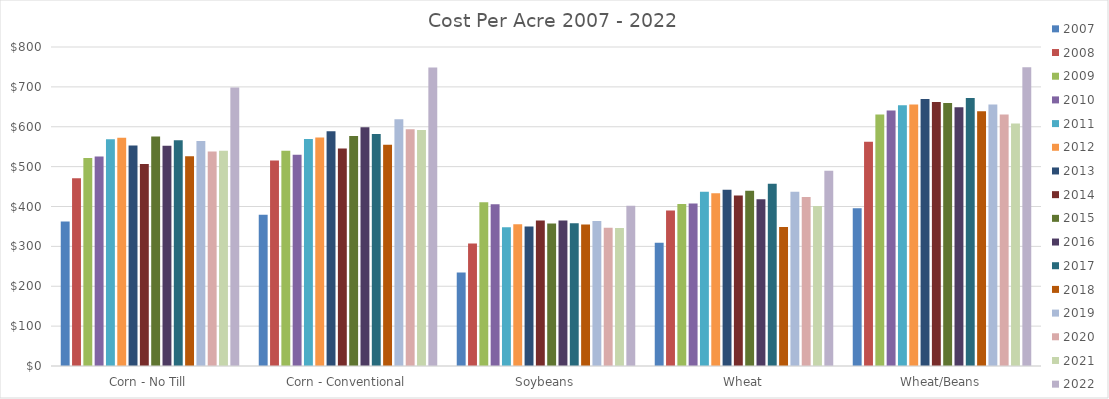
| Category | 2007 | 2008 | 2009 | 2010 | 2011 | 2012 | 2013 | 2014 | 2015 | 2016 | 2017 | 2018 | 2019 | 2020 | 2021 | 2022 |
|---|---|---|---|---|---|---|---|---|---|---|---|---|---|---|---|---|
| Corn - No Till | 362.4 | 470.72 | 521.49 | 525.26 | 568.66 | 572.543 | 552.863 | 506.66 | 575.5 | 552.32 | 566.37 | 525.91 | 564.05 | 538 | 540 | 698.399 |
| Corn - Conventional | 379.4 | 515.34 | 539.81 | 530.09 | 569.32 | 573.21 | 588.641 | 545.525 | 576.73 | 598.86 | 582.01 | 554.55 | 618.82 | 594 | 592 | 748.871 |
| Soybeans | 234.26 | 307.12 | 410.69 | 405.77 | 348.06 | 355.69 | 350.104 | 364.773 | 357.511 | 364.95 | 358.25 | 354.77 | 363.37 | 347 | 346 | 401.658 |
| Wheat | 309.27 | 390.14 | 406.2 | 407.26 | 436.75 | 433.187 | 442.309 | 427.348 | 439.521 | 418.12 | 456.78 | 348.58 | 436.88 | 424 | 401 | 489.682 |
| Wheat/Beans | 395.89 | 562.34 | 630.51 | 640.6 | 653.83 | 655.56 | 669.6 | 662.166 | 659.733 | 649.03 | 671.8 | 638.79 | 656.03 | 630.5 | 608 | 749.383 |